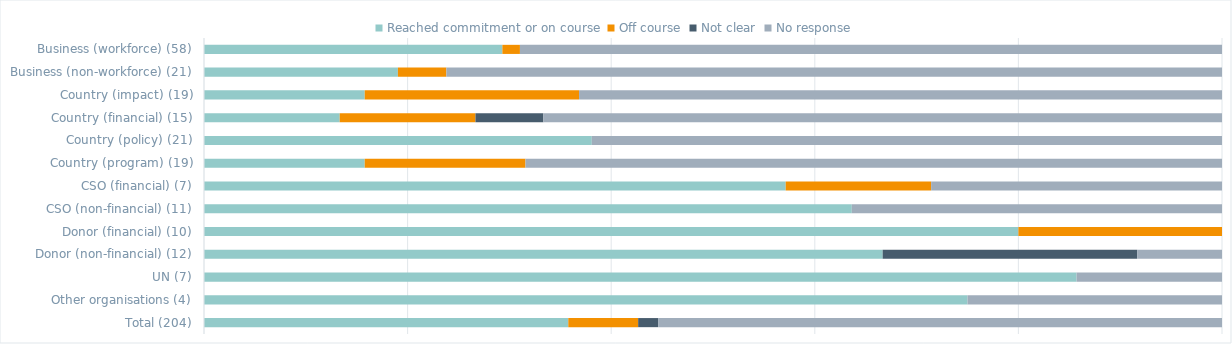
| Category | Reached commitment or on course | Off course | Not clear | No response |
|---|---|---|---|---|
| Business (workforce) (58) | 0.293 | 0.017 | 0 | 0.69 |
| Business (non-workforce) (21) | 0.19 | 0.048 | 0 | 0.762 |
| Country (impact) (19) | 0.158 | 0.211 | 0 | 0.632 |
| Country (financial) (15) | 0.133 | 0.133 | 0.067 | 0.667 |
| Country (policy) (21) | 0.381 | 0 | 0 | 0.619 |
| Country (program) (19) | 0.158 | 0.158 | 0 | 0.684 |
| CSO (financial) (7) | 0.571 | 0.143 | 0 | 0.286 |
| CSO (non-financial) (11) | 0.636 | 0 | 0 | 0.364 |
| Donor (financial) (10) | 0.8 | 0.2 | 0 | 0 |
| Donor (non-financial) (12) | 0.667 | 0 | 0.25 | 0.083 |
| UN (7) | 0.857 | 0 | 0 | 0.143 |
| Other organisations (4) | 0.75 | 0 | 0 | 0.25 |
| Total (204) | 0.358 | 0.069 | 0.02 | 0.554 |